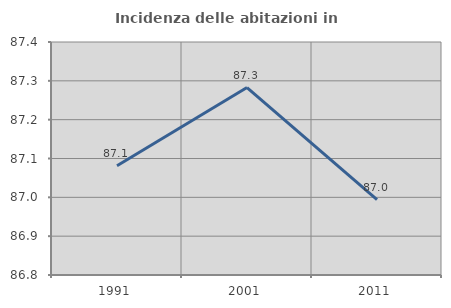
| Category | Incidenza delle abitazioni in proprietà  |
|---|---|
| 1991.0 | 87.081 |
| 2001.0 | 87.283 |
| 2011.0 | 86.994 |